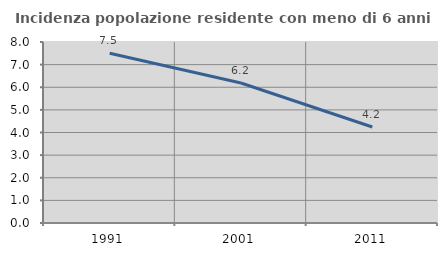
| Category | Incidenza popolazione residente con meno di 6 anni |
|---|---|
| 1991.0 | 7.505 |
| 2001.0 | 6.187 |
| 2011.0 | 4.244 |